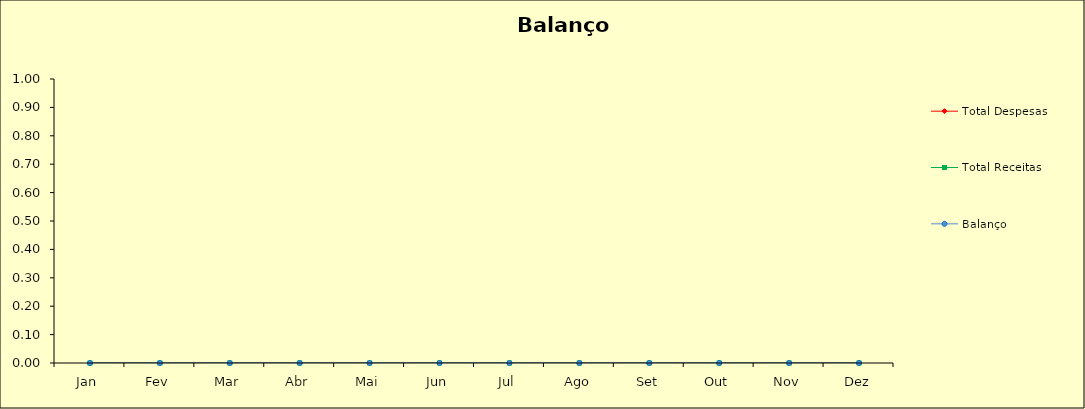
| Category | Total Despesas | Total Receitas | Balanço |
|---|---|---|---|
| Jan | 0 | 0 | 0 |
| Fev | 0 | 0 | 0 |
| Mar | 0 | 0 | 0 |
| Abr | 0 | 0 | 0 |
| Mai | 0 | 0 | 0 |
| Jun | 0 | 0 | 0 |
| Jul | 0 | 0 | 0 |
| Ago | 0 | 0 | 0 |
| Set | 0 | 0 | 0 |
| Out | 0 | 0 | 0 |
| Nov | 0 | 0 | 0 |
| Dez | 0 | 0 | 0 |